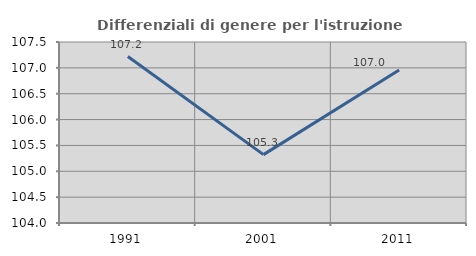
| Category | Differenziali di genere per l'istruzione superiore |
|---|---|
| 1991.0 | 107.218 |
| 2001.0 | 105.322 |
| 2011.0 | 106.959 |